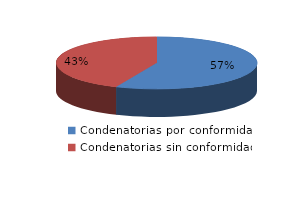
| Category | Series 0 |
|---|---|
| 0 | 1188 |
| 1 | 913 |